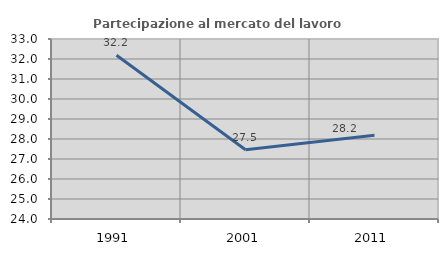
| Category | Partecipazione al mercato del lavoro  femminile |
|---|---|
| 1991.0 | 32.184 |
| 2001.0 | 27.458 |
| 2011.0 | 28.19 |